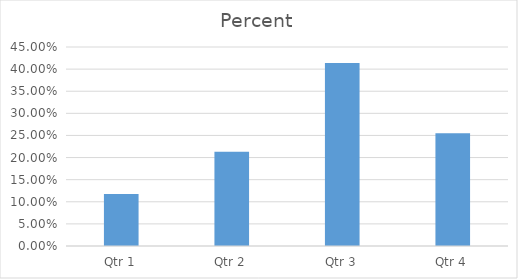
| Category | Percent |
|---|---|
| Qtr 1 | 0.118 |
| Qtr 2 | 0.213 |
| Qtr 3 | 0.414 |
| Qtr 4 | 0.255 |